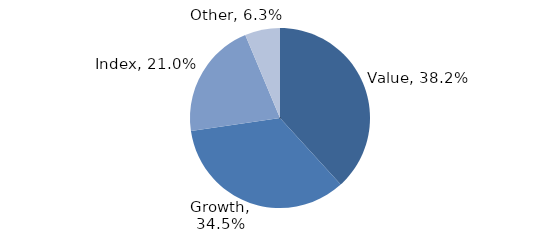
| Category | Investment Style |
|---|---|
| Value | 0.382 |
| Growth | 0.345 |
| Index | 0.21 |
| Other | 0.063 |